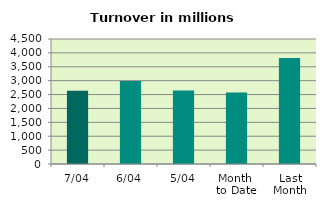
| Category | Series 0 |
|---|---|
| 7/04 | 2633.301 |
| 6/04 | 2989.725 |
| 5/04 | 2649.622 |
| Month 
to Date | 2570.025 |
| Last
Month | 3816.191 |